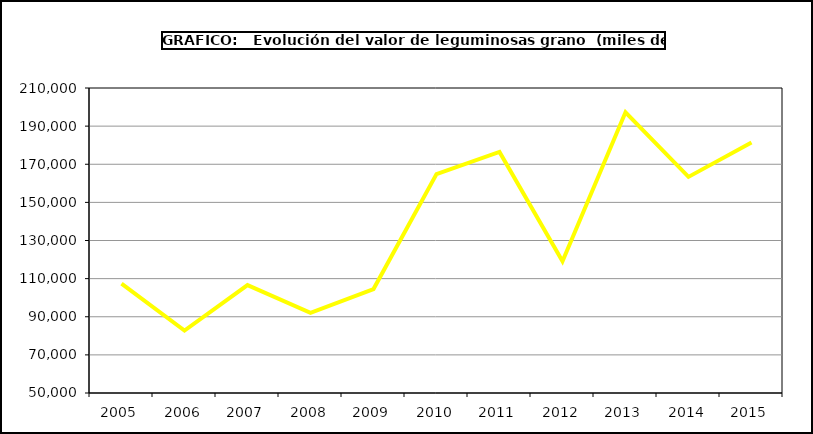
| Category | Valor |
|---|---|
| 2005.0 | 107411.341 |
| 2006.0 | 82751.324 |
| 2007.0 | 106590.461 |
| 2008.0 | 92023.432 |
| 2009.0 | 104521.39 |
| 2010.0 | 164853 |
| 2011.0 | 176441 |
| 2012.0 | 119054.324 |
| 2013.0 | 197282.867 |
| 2014.0 | 163368.079 |
| 2015.0 | 181398 |